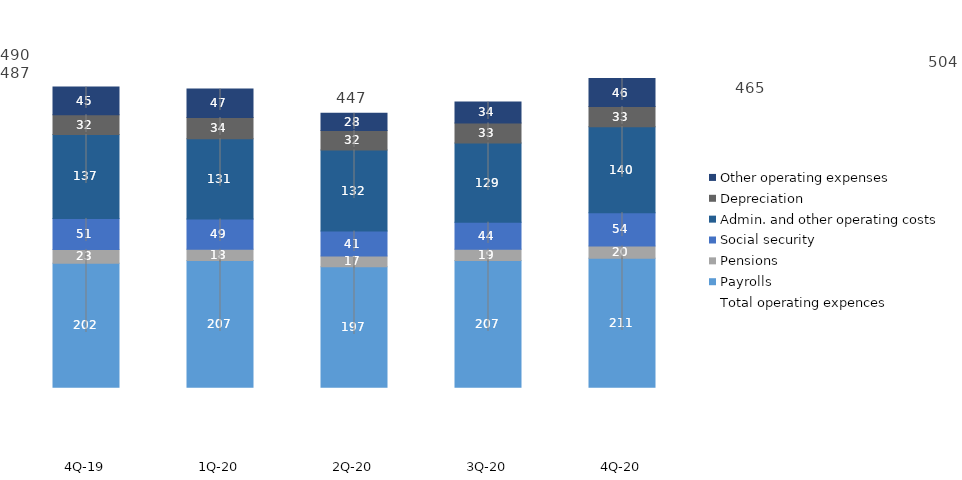
| Category | Payrolls | Pensions | Social security | Admin. and other operating costs | Depreciation | Other operating expenses |
|---|---|---|---|---|---|---|
| 4Q-20 | 210.623 | 19.854 | 54.351 | 140.351 | 32.718 | 45.632 |
| 3Q-20 | 206.727 | 18.585 | 43.952 | 129.288 | 32.697 | 34.057 |
| 2Q-20 | 196.66 | 17.386 | 40.656 | 132.408 | 31.771 | 27.996 |
| 1Q-20 | 206.729 | 18.337 | 49.424 | 130.978 | 34.5 | 46.562 |
| 4Q-19 | 202.122 | 22.717 | 50.527 | 137.063 | 32.223 | 45.052 |